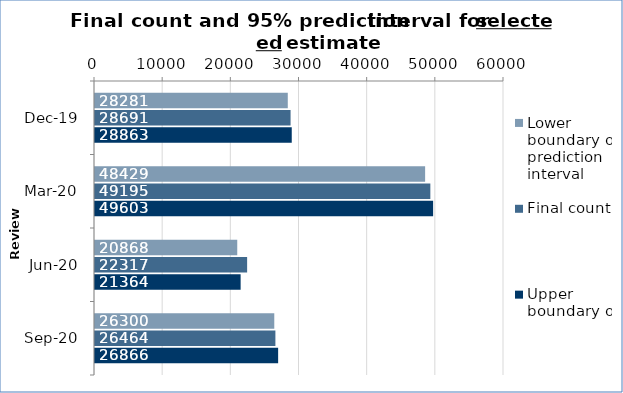
| Category | Lower boundary of prediction interval | Final count | Upper boundary of prediction interval |
|---|---|---|---|
| 2019-12-01 | 28281 | 28691 | 28863 |
| 2020-03-01 | 48429 | 49195 | 49603 |
| 2020-06-01 | 20868 | 22317 | 21364 |
| 2020-09-01 | 26300 | 26464 | 26866 |